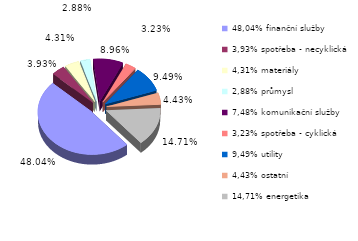
| Category | Series 0 |
|---|---|
| 48,04% finanční služby | 0.48 |
| 3,93% spotřeba - necyklická | 0.039 |
| 4,31% materiály | 0.043 |
| 2,88% průmysl | 0.029 |
| 7,48% komunikační služby | 0.09 |
| 3,23% spotřeba - cyklická | 0.032 |
| 9,49% utility | 0.095 |
| 4,43% ostatní | 0.044 |
| 14,71% energetika | 0.147 |